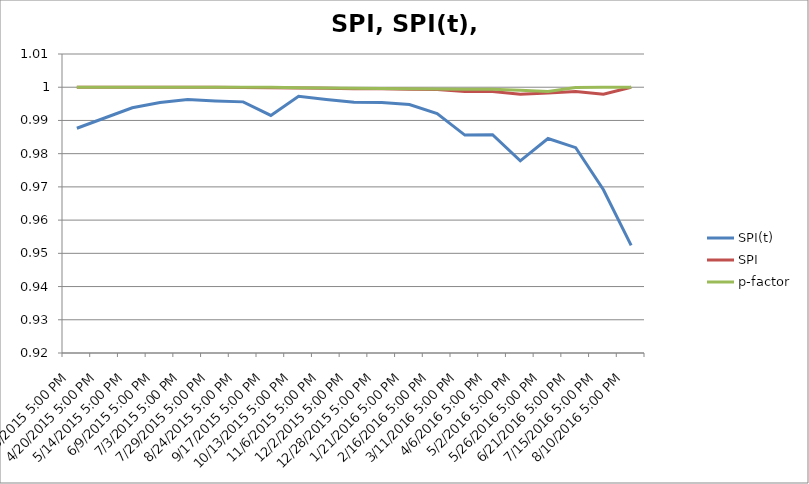
| Category | SPI(t) | SPI | p-factor |
|---|---|---|---|
| 3/25/2015 5:00 PM | 0.988 | 1 | 1 |
| 4/20/2015 5:00 PM | 0.991 | 1 | 1 |
| 5/14/2015 5:00 PM | 0.994 | 1 | 1 |
| 6/9/2015 5:00 PM | 0.995 | 1 | 1 |
| 7/3/2015 5:00 PM | 0.996 | 1 | 1 |
| 7/29/2015 5:00 PM | 0.996 | 1 | 1 |
| 8/24/2015 5:00 PM | 0.996 | 1 | 1 |
| 9/17/2015 5:00 PM | 0.992 | 1 | 1 |
| 10/13/2015 5:00 PM | 0.997 | 1 | 1 |
| 11/6/2015 5:00 PM | 0.996 | 1 | 1 |
| 12/2/2015 5:00 PM | 0.996 | 1 | 1 |
| 12/28/2015 5:00 PM | 0.995 | 1 | 1 |
| 1/21/2016 5:00 PM | 0.995 | 0.999 | 1 |
| 2/16/2016 5:00 PM | 0.992 | 0.999 | 0.999 |
| 3/11/2016 5:00 PM | 0.986 | 0.999 | 0.999 |
| 4/6/2016 5:00 PM | 0.986 | 0.999 | 0.999 |
| 5/2/2016 5:00 PM | 0.978 | 0.998 | 0.999 |
| 5/26/2016 5:00 PM | 0.985 | 0.998 | 0.999 |
| 6/21/2016 5:00 PM | 0.982 | 0.999 | 1 |
| 7/15/2016 5:00 PM | 0.969 | 0.998 | 1 |
| 8/10/2016 5:00 PM | 0.952 | 1 | 1 |